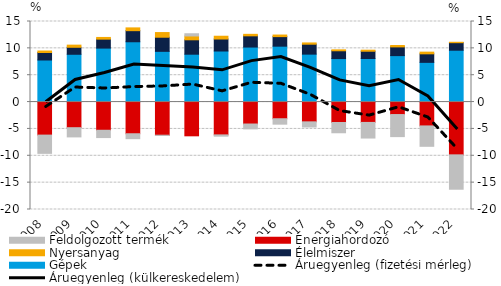
| Category | Gépek | Élelmiszer | Nyersanyag | Energiahordozó | Feldolgozott termék |
|---|---|---|---|---|---|
| 2008.0 | 7.832 | 1.397 | 0.276 | -6.149 | -3.399 |
| 2009.0 | 8.898 | 1.302 | 0.399 | -4.769 | -1.716 |
| 2010.0 | 10.047 | 1.669 | 0.316 | -5.248 | -1.36 |
| 2011.0 | 11.227 | 2.067 | 0.517 | -5.899 | -0.915 |
| 2012.0 | 9.444 | 2.629 | 0.868 | -6.168 | -0.043 |
| 2013.0 | 8.911 | 2.683 | 0.709 | -6.282 | 0.42 |
| 2014.0 | 9.505 | 2.234 | 0.517 | -6.111 | -0.239 |
| 2015.0 | 10.241 | 2.09 | 0.28 | -4.085 | -0.905 |
| 2016.0 | 10.404 | 1.781 | 0.294 | -3.104 | -1.009 |
| 2017.0 | 8.923 | 1.85 | 0.235 | -3.682 | -0.959 |
| 2018.0 | 8.097 | 1.453 | 0.173 | -3.798 | -1.914 |
| 2019.0 | 8.116 | 1.349 | 0.197 | -3.789 | -2.908 |
| 2020.0 | 8.649 | 1.623 | 0.256 | -2.322 | -4.109 |
| 2021.0 | 7.394 | 1.589 | 0.313 | -4.442 | -3.794 |
| 2022.0 | 9.653 | 1.402 | 0.077 | -9.826 | -6.4 |